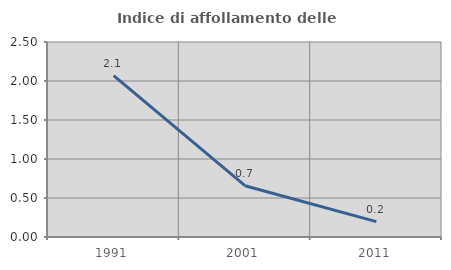
| Category | Indice di affollamento delle abitazioni  |
|---|---|
| 1991.0 | 2.069 |
| 2001.0 | 0.658 |
| 2011.0 | 0.196 |